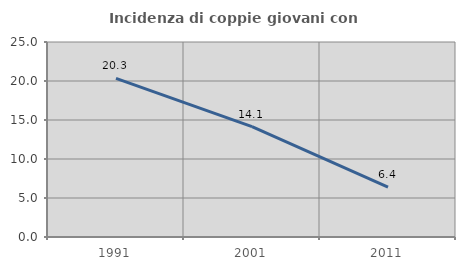
| Category | Incidenza di coppie giovani con figli |
|---|---|
| 1991.0 | 20.341 |
| 2001.0 | 14.145 |
| 2011.0 | 6.4 |